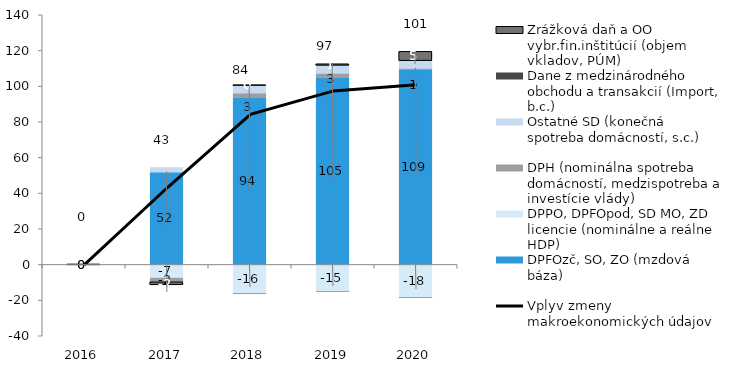
| Category | DPFOzč, SO, ZO (mzdová báza) | DPPO, DPFOpod, SD MO, ZD licencie (nominálne a reálne HDP) | DPH (nominálna spotreba domácností, medzispotreba a investície vlády) | Ostatné SD (konečná spotreba domácností, s.c.) | Dane z medzinárodného obchodu a transakcií (Import, b.c.) | Zrážková daň a OO vybr.fin.inštitúcií (objem vkladov, PÚM) |
|---|---|---|---|---|---|---|
| 2016.0 | 0 | 0 | 0 | 0 | 0 | 0 |
| 2017.0 | 52.28 | -7.366 | -2.108 | 2.41 | -0.316 | -1.641 |
| 2018.0 | 93.828 | -16.124 | 2.65 | 3.916 | -0.341 | 0.335 |
| 2019.0 | 105.117 | -14.749 | 2.569 | 3.93 | -0.351 | 0.923 |
| 2020.0 | 109.223 | -18.221 | 1.195 | 3.838 | -0.378 | 5.236 |